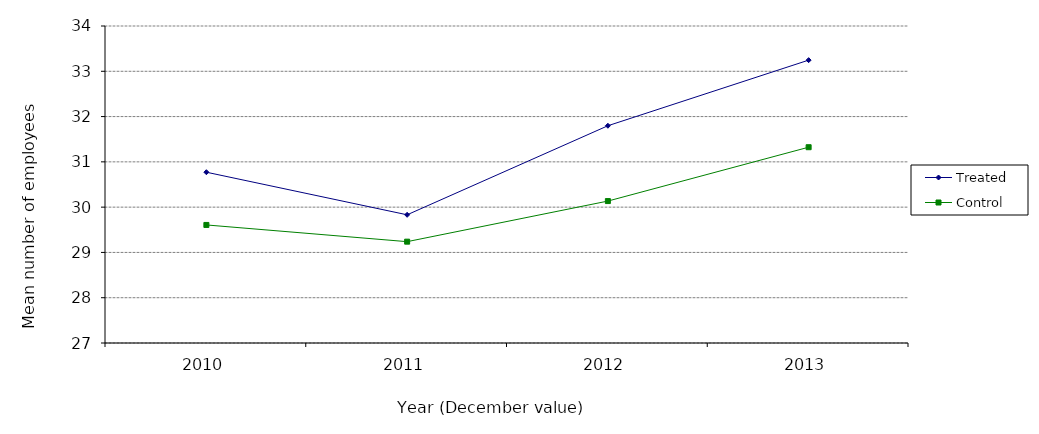
| Category | Treated | Control |
|---|---|---|
| 2010.0 | 30.771 | 29.607 |
| 2011.0 | 29.831 | 29.238 |
| 2012.0 | 31.797 | 30.134 |
| 2013.0 | 33.246 | 31.323 |